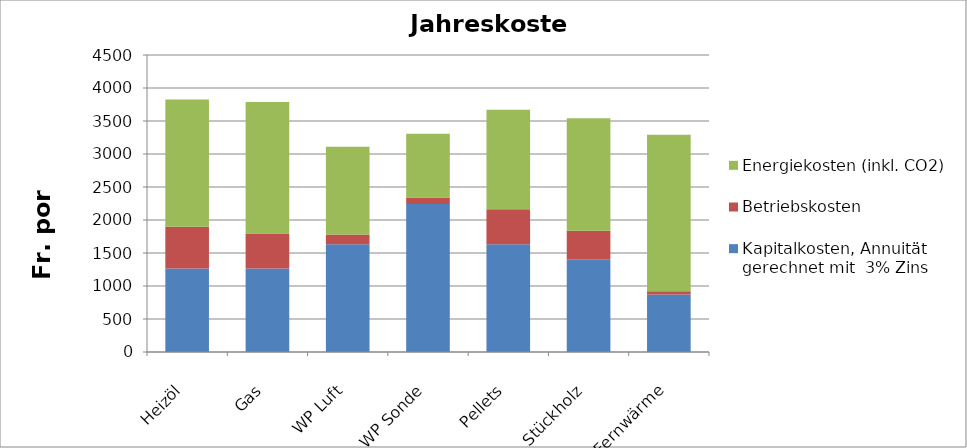
| Category | Kapitalkosten, Annuität gerechnet mit  3% Zins | Betriebskosten | Energiekosten (inkl. CO2) |
|---|---|---|---|
| Heizöl | 1266.3 | 630 | 1930 |
| Gas | 1266.3 | 530 | 1990 |
| WP Luft | 1632.12 | 150 | 1327.692 |
| WP Sonde | 2242.758 | 100 | 964.444 |
| Pellets | 1632.12 | 530 | 1510 |
| Stückholz | 1407 | 430 | 1705.978 |
| Fernwärme | 872.34 | 50 | 2370 |